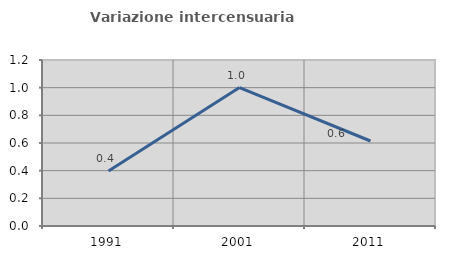
| Category | Variazione intercensuaria annua |
|---|---|
| 1991.0 | 0.398 |
| 2001.0 | 1.001 |
| 2011.0 | 0.615 |